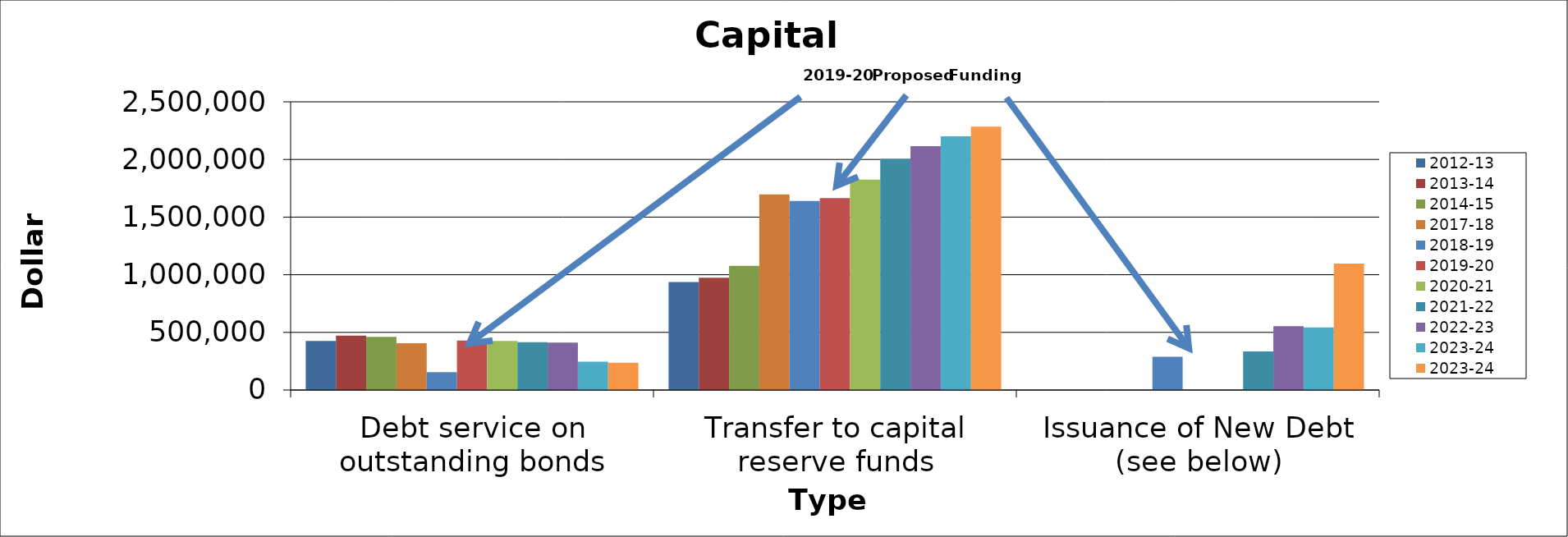
| Category | 2012-13 | 2013-14 | 2014-15 | 2015-16 | 2017-18 | 2018-19 | 2019-20 | 2020-21 | 2021-22 | 2022-23 | 2023-24 |
|---|---|---|---|---|---|---|---|---|---|---|---|
| Debt service on outstanding bonds | 425405.5 | 472025.5 | 461396.75 |  | 406500 | 155525 | 429915 | 425435 | 415761 | 410731 | 236240 |
| Transfer to capital reserve funds | 937000 | 974000 | 1077000 |  | 1697000 | 1640000 | 1665000 | 1825000 | 2005000 | 2115000 | 2285000 |
| Issuance of New Debt (see below) | 0 | 0 | 0 |  | 0 | 288101 | 0 | 0 | 334160 | 553672 | 1096806 |